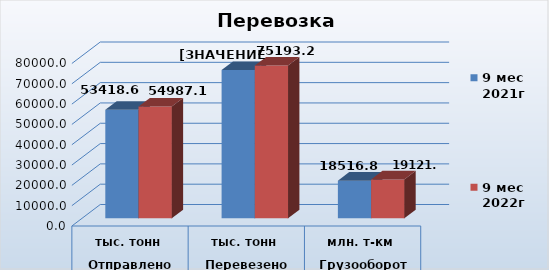
| Category | 9 мес 2021г | 9 мес 2022г |
|---|---|---|
| 0 | 53418.6 | 54987.1 |
| 1 | 72974.7 | 75193.2 |
| 2 | 18516.8 | 19121.6 |